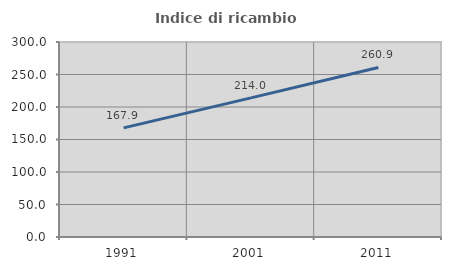
| Category | Indice di ricambio occupazionale  |
|---|---|
| 1991.0 | 167.857 |
| 2001.0 | 214 |
| 2011.0 | 260.87 |